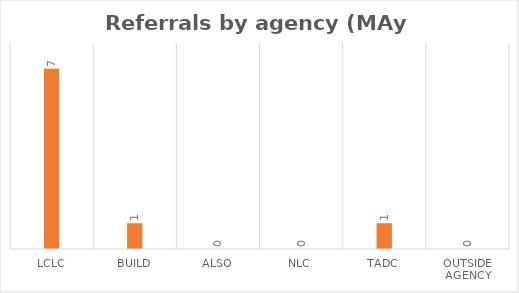
| Category | Series 0 |
|---|---|
| LCLC | 7 |
| BUILD | 1 |
| ALSO | 0 |
| NLC | 0 |
| TADC | 1 |
| Outside Agency | 0 |